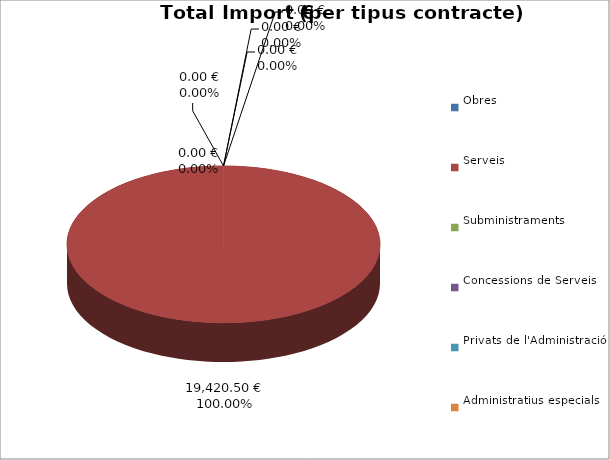
| Category | Total preu
(amb IVA) |
|---|---|
| Obres | 0 |
| Serveis | 19420.5 |
| Subministraments | 0 |
| Concessions de Serveis | 0 |
| Privats de l'Administració | 0 |
| Administratius especials | 0 |